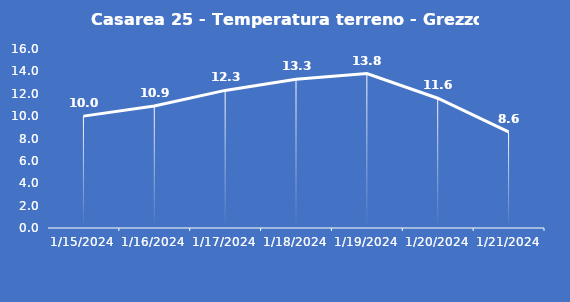
| Category | Casarea 25 - Temperatura terreno - Grezzo (°C) |
|---|---|
| 1/15/24 | 10 |
| 1/16/24 | 10.9 |
| 1/17/24 | 12.3 |
| 1/18/24 | 13.3 |
| 1/19/24 | 13.8 |
| 1/20/24 | 11.6 |
| 1/21/24 | 8.6 |